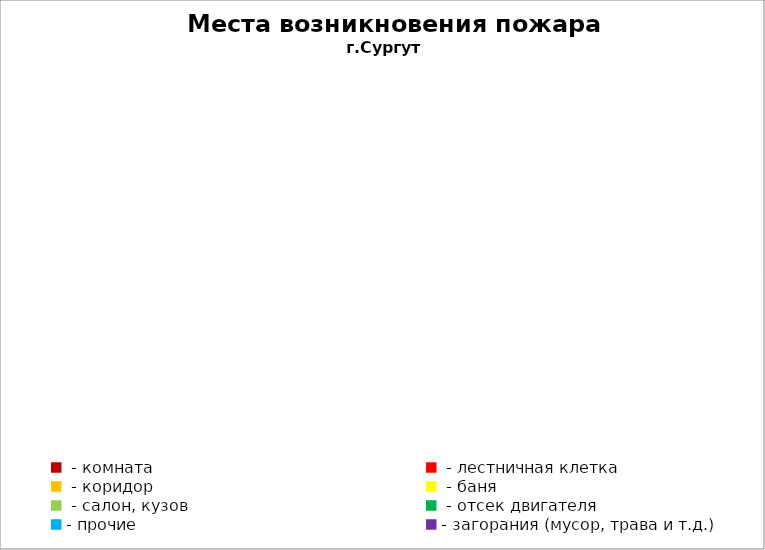
| Category | Места возникновения пожара |
|---|---|
|  - комната | 47 |
|  - лестничная клетка | 9 |
|  - коридор | 8 |
|  - баня | 24 |
|  - салон, кузов | 14 |
|  - отсек двигателя | 32 |
| - прочие | 63 |
| - загорания (мусор, трава и т.д.)  | 112 |